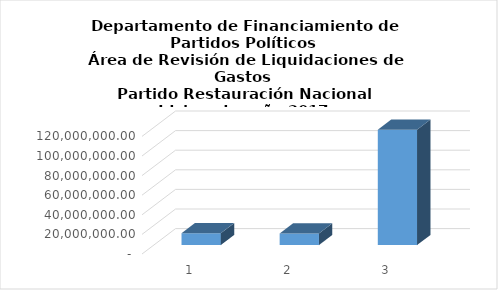
| Category | Series 0 |
|---|---|
| 0 | 12071974 |
| 1 | 11817001 |
| 2 | 117667247.38 |